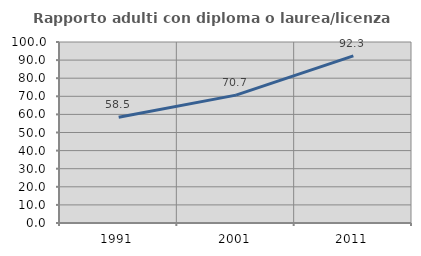
| Category | Rapporto adulti con diploma o laurea/licenza media  |
|---|---|
| 1991.0 | 58.477 |
| 2001.0 | 70.651 |
| 2011.0 | 92.319 |